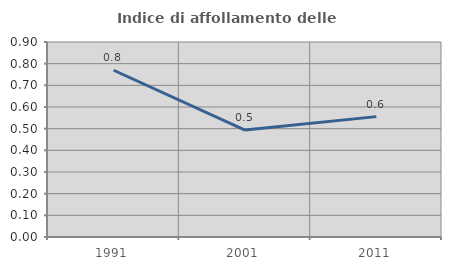
| Category | Indice di affollamento delle abitazioni  |
|---|---|
| 1991.0 | 0.77 |
| 2001.0 | 0.493 |
| 2011.0 | 0.556 |